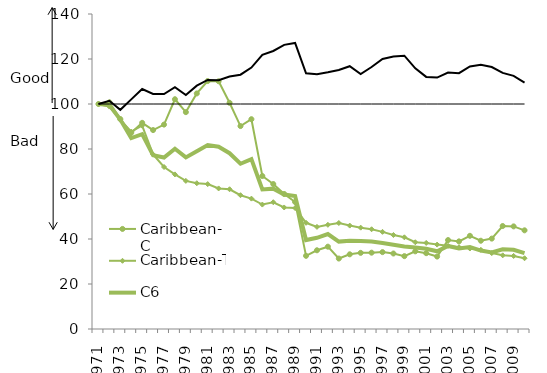
| Category | Caribbean-C | Caribbean-T | C6 | OECS | Series 4 |
|---|---|---|---|---|---|
| 1971.0 | 100 | 100 | 100 | 100 | 100 |
| 1972.0 | 100.747 | 98.849 | 99.516 | 101.401 | 100 |
| 1973.0 | 93.31 | 92.937 | 93.098 | 97.415 | 100 |
| 1974.0 | 87.201 | 87.745 | 84.842 | 102.066 | 100 |
| 1975.0 | 91.631 | 90.369 | 86.605 | 106.642 | 100 |
| 1976.0 | 88.412 | 77.58 | 77.188 | 104.491 | 100 |
| 1977.0 | 90.852 | 72.004 | 76.209 | 104.443 | 100 |
| 1978.0 | 102.118 | 68.713 | 80.135 | 107.457 | 100 |
| 1979.0 | 96.388 | 65.839 | 76.272 | 104.015 | 100 |
| 1980.0 | 104.702 | 64.789 | 79.022 | 108.137 | 100 |
| 1981.0 | 110.208 | 64.401 | 81.766 | 110.68 | 100 |
| 1982.0 | 110.107 | 62.476 | 81.039 | 110.593 | 100 |
| 1983.0 | 100.533 | 62.107 | 78.125 | 112.228 | 100 |
| 1984.0 | 90.195 | 59.463 | 73.452 | 113.02 | 100 |
| 1985.0 | 93.245 | 57.951 | 75.488 | 116.173 | 100 |
| 1986.0 | 67.989 | 55.303 | 62.051 | 121.821 | 100 |
| 1987.0 | 64.423 | 56.344 | 62.38 | 123.569 | 100 |
| 1988.0 | 60.001 | 54.019 | 59.743 | 126.289 | 100 |
| 1989.0 | 56.451 | 53.75 | 59.115 | 127.114 | 100 |
| 1990.0 | 32.521 | 47.202 | 39.528 | 113.63 | 100 |
| 1991.0 | 34.983 | 45.386 | 40.519 | 113.178 | 100 |
| 1992.0 | 36.588 | 46.303 | 42.218 | 114.077 | 100 |
| 1993.0 | 31.316 | 47.105 | 38.857 | 115.144 | 100 |
| 1994.0 | 33.191 | 45.96 | 39.266 | 116.794 | 100 |
| 1995.0 | 33.839 | 45.039 | 39.101 | 113.327 | 100 |
| 1996.0 | 33.92 | 44.329 | 38.874 | 116.423 | 100 |
| 1997.0 | 34.168 | 43.179 | 38.203 | 120.034 | 100 |
| 1998.0 | 33.552 | 41.778 | 37.446 | 121.107 | 100 |
| 1999.0 | 32.381 | 40.75 | 36.694 | 121.461 | 100 |
| 2000.0 | 34.527 | 38.55 | 36.258 | 115.833 | 100 |
| 2001.0 | 33.702 | 38.254 | 35.656 | 112.044 | 100 |
| 2002.0 | 32.199 | 37.513 | 34.525 | 111.758 | 100 |
| 2003.0 | 39.522 | 36.952 | 36.917 | 113.973 | 100 |
| 2004.0 | 38.946 | 36.353 | 35.776 | 113.722 | 100 |
| 2005.0 | 41.413 | 35.764 | 36.412 | 116.716 | 100 |
| 2006.0 | 39.227 | 35.187 | 34.85 | 117.446 | 100 |
| 2007.0 | 40.177 | 33.743 | 34.062 | 116.444 | 100 |
| 2008.0 | 45.77 | 32.75 | 35.461 | 113.814 | 100 |
| 2009.0 | 45.608 | 32.484 | 35.202 | 112.508 | 100 |
| 2010.0 | 43.858 | 31.444 | 33.688 | 109.534 | 100 |